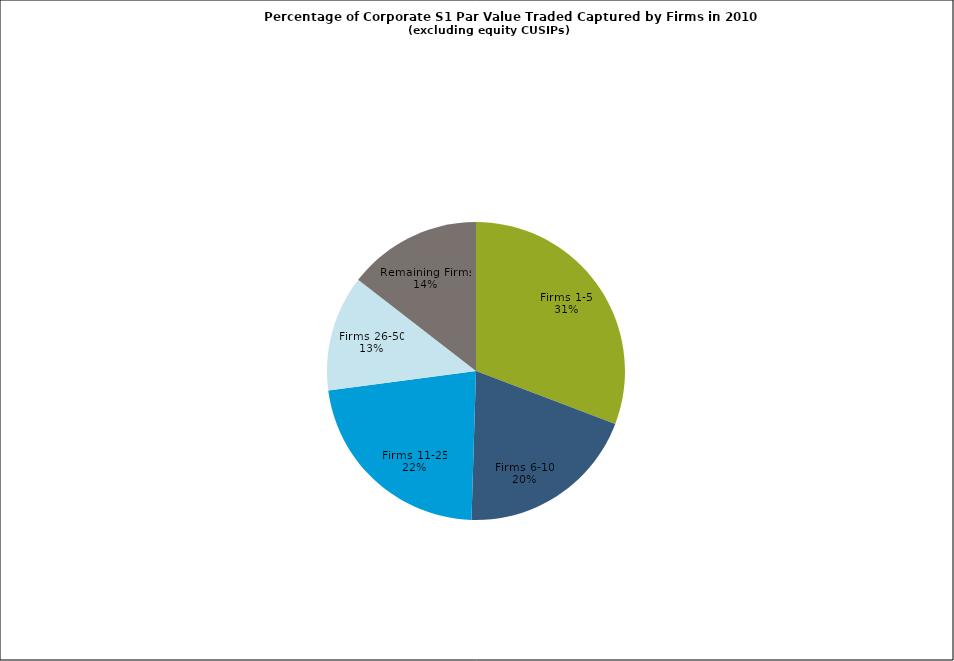
| Category | Series 0 |
|---|---|
| Firms 1-5 | 0.308 |
| Firms 6-10 | 0.197 |
| Firms 11-25 | 0.224 |
| Firms 26-50 | 0.126 |
| Remaining Firms | 0.145 |